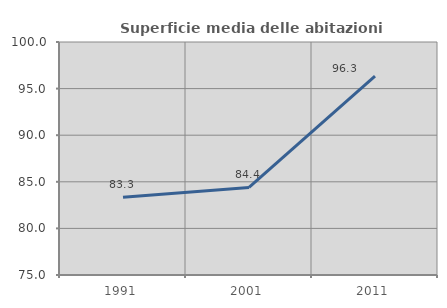
| Category | Superficie media delle abitazioni occupate |
|---|---|
| 1991.0 | 83.333 |
| 2001.0 | 84.401 |
| 2011.0 | 96.335 |